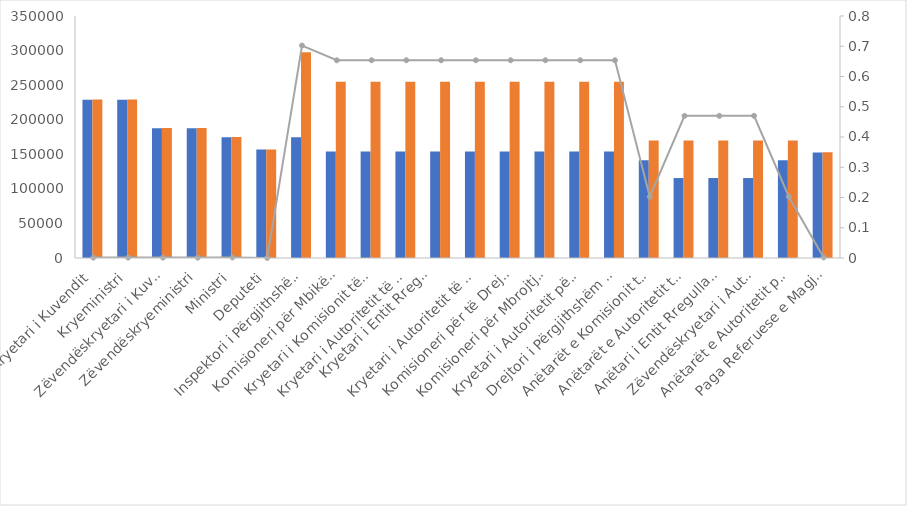
| Category | Paga Bruto Ishte | Paga Bruto planifikohet |
|---|---|---|
| Kryetari i Kuvendit | 228730 | 229075 |
| Kryeministri | 228730 | 229075 |
| Zëvendëskryetari i Kuvendit | 187610 | 187850 |
| Zëvendëskryeministri | 187610 | 187850 |
| Ministri | 174760 | 175100 |
| Deputeti | 156770 | 156825 |
| Inspektori i Përgjithshëm i Inspektoratit të Lartë të Deklarimit dhe Kontrollit të Pasurive dhe Konfliktit të Interesave | 174760 | 297500 |
| Komisioneri për Mbikëqyrjen e Shërbimit Civil  | 154200 | 255000 |
| Kryetari i Komisionit të Autoritetit të Konkurrencës | 154200 | 255000 |
| Kryetari i Autoritetit të Komunikimeve Elektronike dhe Postare | 154200 | 255000 |
| Kryetari i Entit Rregullator të Sektorit të Furnizimit me Ujë dhe
Largimit e Përpunimit të Ujërave të Ndotura | 154200 | 255000 |
| Kryetari i Autoritetit të Mediave Audiovizive | 154200 | 255000 |
| Komisioneri për të Drejtën e Informimit dhe Mbrojtjen e të Dhënave Personale | 154200 | 255000 |
| Komisioneri për Mbrojtjen nga Diskriminimi | 154200 | 255000 |
| Kryetari i Autoritetit për Informimin mbi Dokumentet e ish Sigurimit të Shtetit | 154200 | 255000 |
| Drejtori i Përgjithshëm i Institutit të Statistikave | 154200 | 255000 |
| Anëtarët e Komisionit të Konkurrencës | 141350 | 170000 |
| Anëtarët e Autoritetit të Komunikimeve Elektronike dhe Postare  | 115650 | 170000 |
| Anëtari i Entit Rregullator të Sektorit të Furnizimit me Ujë dhe Largimit e Përpunimit të Ujërave të Ndotura  | 115650 | 170000 |
| Zëvendëskryetari i Autoritetit të Mediave Audiovizive | 115650 | 170000 |
| Anëtarët e Autoritetit për Informimin mbi Dokumentet e ish Sigurimit të Shtetit | 141350 | 170000 |
| Paga Referuese e Magjistratit | 152700 | 153000 |